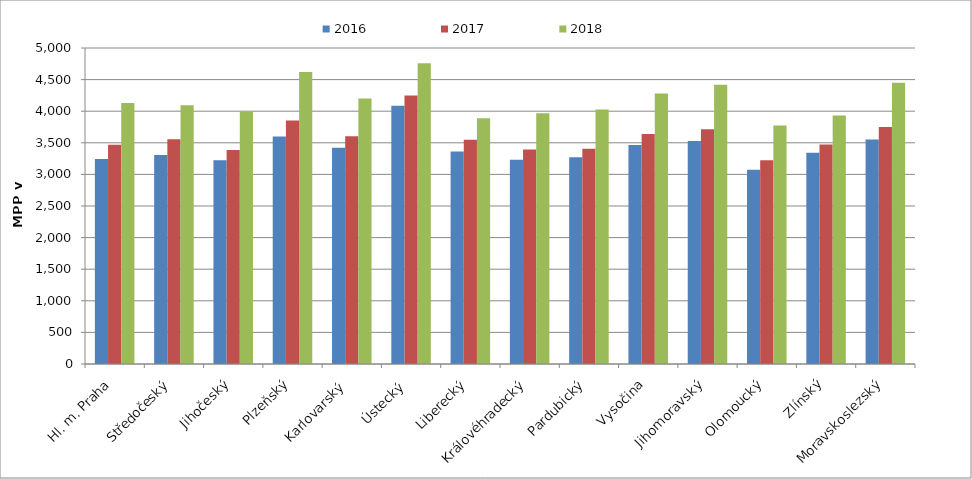
| Category | 2016 | 2017 | 2018 |
|---|---|---|---|
| Hl. m. Praha | 3243.362 | 3470.352 | 4129.79 |
| Středočeský | 3307.108 | 3557.624 | 4094.963 |
| Jihočeský | 3224.501 | 3385.35 | 3991.368 |
| Plzeňský | 3598.929 | 3850.926 | 4621.111 |
| Karlovarský  | 3421.9 | 3603.364 | 4199.604 |
| Ústecký   | 4085.243 | 4248.641 | 4758.35 |
| Liberecký | 3363.139 | 3547.605 | 3889.549 |
| Královéhradecký | 3230.769 | 3392.308 | 3968.998 |
| Pardubický | 3272.91 | 3403.927 | 4028.32 |
| Vysočina | 3463.807 | 3639.794 | 4280.442 |
| Jihomoravský | 3526.555 | 3714.516 | 4417.314 |
| Olomoucký | 3071.909 | 3225.527 | 3773.903 |
| Zlínský | 3341.865 | 3471.826 | 3930.703 |
| Moravskoslezský | 3553.128 | 3748.785 | 4450.54 |